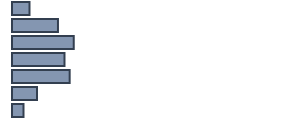
| Category | Series 0 |
|---|---|
| 0 | 6.4 |
| 1 | 16.9 |
| 2 | 22.7 |
| 3 | 19.3 |
| 4 | 21.2 |
| 5 | 9.2 |
| 6 | 4.2 |